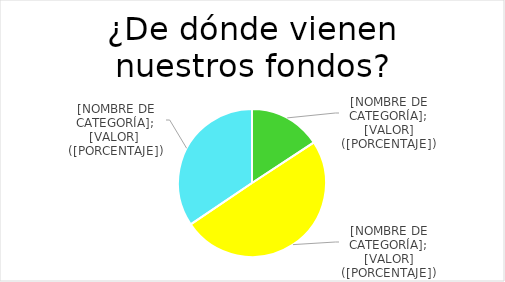
| Category | Series 0 |
|---|---|
| Donaciones/ subvenciones | 950 |
| Personas socias | 2999.01 |
| Campañas | 2075.53 |